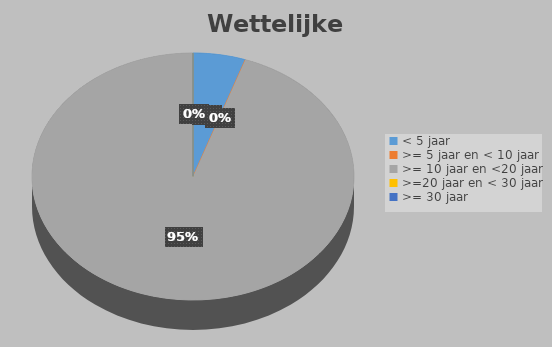
| Category | Series 0 |
|---|---|
| < 5 jaar | 0.053 |
| >= 5 jaar en < 10 jaar | 0 |
| >= 10 jaar en <20 jaar | 0.947 |
| >=20 jaar en < 30 jaar | 0 |
| >= 30 jaar | 0 |